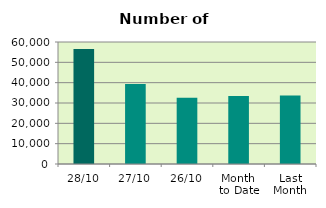
| Category | Series 0 |
|---|---|
| 28/10 | 56566 |
| 27/10 | 39386 |
| 26/10 | 32586 |
| Month 
to Date | 33387.9 |
| Last
Month | 33733.273 |